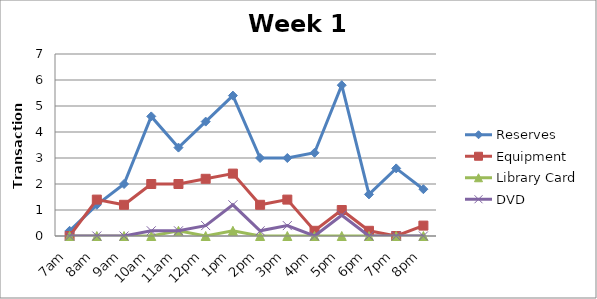
| Category | Reserves | Equipment | Library Card | DVD |
|---|---|---|---|---|
| 7am | 0.2 | 0 | 0 | 0 |
| 8am | 1.2 | 1.4 | 0 | 0 |
| 9am | 2 | 1.2 | 0 | 0 |
| 10am | 4.6 | 2 | 0 | 0.2 |
| 11am | 3.4 | 2 | 0.2 | 0.2 |
| 12pm | 4.4 | 2.2 | 0 | 0.4 |
| 1pm | 5.4 | 2.4 | 0.2 | 1.2 |
| 2pm | 3 | 1.2 | 0 | 0.2 |
| 3pm | 3 | 1.4 | 0 | 0.4 |
| 4pm | 3.2 | 0.2 | 0 | 0 |
| 5pm | 5.8 | 1 | 0 | 0.8 |
| 6pm | 1.6 | 0.2 | 0 | 0 |
| 7pm | 2.6 | 0 | 0 | 0 |
| 8pm | 1.8 | 0.4 | 0 | 0 |